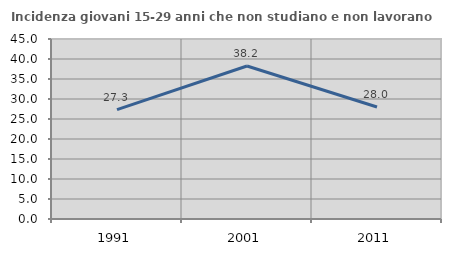
| Category | Incidenza giovani 15-29 anni che non studiano e non lavorano  |
|---|---|
| 1991.0 | 27.336 |
| 2001.0 | 38.24 |
| 2011.0 | 27.997 |